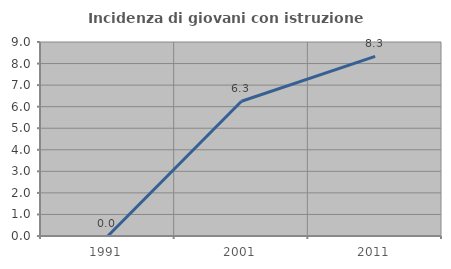
| Category | Incidenza di giovani con istruzione universitaria |
|---|---|
| 1991.0 | 0 |
| 2001.0 | 6.25 |
| 2011.0 | 8.333 |